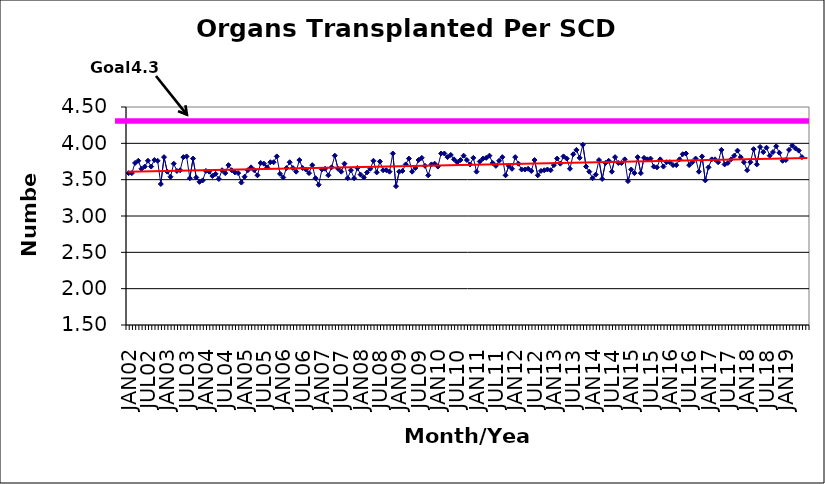
| Category | Series 0 |
|---|---|
| JAN02 | 3.59 |
| FEB02 | 3.59 |
| MAR02 | 3.73 |
| APR02 | 3.76 |
| MAY02 | 3.65 |
| JUN02 | 3.68 |
| JUL02 | 3.76 |
| AUG02 | 3.68 |
| SEP02 | 3.77 |
| OCT02 | 3.76 |
| NOV02 | 3.44 |
| DEC02 | 3.81 |
| JAN03 | 3.61 |
| FEB03 | 3.54 |
| MAR03 | 3.72 |
| APR03 | 3.62 |
| MAY03 | 3.63 |
| JUN03 | 3.81 |
| JUL03 | 3.82 |
| AUG03 | 3.52 |
| SEP03 | 3.79 |
| OCT03 | 3.53 |
| NOV03 | 3.47 |
| DEC03 | 3.49 |
| JAN04 | 3.62 |
| FEB04 | 3.61 |
| MAR04 | 3.55 |
| APR04 | 3.58 |
| MAY04 | 3.51 |
| JUN04 | 3.63 |
| JUL04 | 3.59 |
| AUG04 | 3.7 |
| SEP04 | 3.63 |
| OCT04 | 3.6 |
| NOV04 | 3.59 |
| DEC04 | 3.46 |
| JAN05 | 3.54 |
| FEB05 | 3.63 |
| MAR05 | 3.67 |
| APR05 | 3.63 |
| MAY05 | 3.56 |
| JUN05 | 3.73 |
| JUL05 | 3.72 |
| AUG05 | 3.67 |
| SEP05 | 3.74 |
| OCT05 | 3.74 |
| NOV05 | 3.82 |
| DEC05 | 3.58 |
| JAN06 | 3.53 |
| FEB06 | 3.66 |
| MAR06 | 3.74 |
| APR06 | 3.66 |
| MAY06 | 3.61 |
| JUN06 | 3.77 |
| JUL06 | 3.66 |
| AUG06 | 3.64 |
| SEP06 | 3.59 |
| OCT06 | 3.7 |
| NOV06 | 3.52 |
| DEC06 | 3.43 |
| JAN07 | 3.64 |
| FEB07 | 3.65 |
| MAR07 | 3.56 |
| APR07 | 3.67 |
| MAY07 | 3.83 |
| JUN07 | 3.65 |
| JUL07 | 3.61 |
| AUG07 | 3.72 |
| SEP07 | 3.52 |
| OCT07 | 3.63 |
| NOV07 | 3.52 |
| DEC07 | 3.66 |
| JAN08 | 3.57 |
| FEB08 | 3.53 |
| MAR08 | 3.6 |
| APR08 | 3.65 |
| MAY08 | 3.76 |
| JUN08 | 3.6 |
| JUL08 | 3.75 |
| AUG08 | 3.63 |
| SEP08 | 3.63 |
| OCT08 | 3.61 |
| NOV08 | 3.86 |
| DEC08 | 3.41 |
| JAN09 | 3.61 |
| FEB09 | 3.62 |
| MAR09 | 3.71 |
| APR09 | 3.79 |
| MAY09 | 3.61 |
| JUN09 | 3.66 |
| JUL09 | 3.77 |
| AUG09 | 3.8 |
| SEP09 | 3.69 |
| OCT09 | 3.56 |
| NOV09 | 3.71 |
| DEC09 | 3.72 |
| JAN10 | 3.68 |
| FEB10 | 3.86 |
| MAR10 | 3.86 |
| APR10 | 3.81 |
| MAY10 | 3.84 |
| JUN10 | 3.78 |
| JUL10 | 3.74 |
| AUG10 | 3.77 |
| SEP10 | 3.83 |
| OCT10 | 3.77 |
| NOV10 | 3.71 |
| DEC10 | 3.8 |
| JAN11 | 3.61 |
| FEB11 | 3.75 |
| MAR11 | 3.79 |
| APR11 | 3.8 |
| MAY11 | 3.83 |
| JUN11 | 3.73 |
| JUL11 | 3.69 |
| AUG11 | 3.76 |
| SEP11 | 3.81 |
| OCT11 | 3.56 |
| NOV11 | 3.69 |
| DEC11 | 3.65 |
| JAN12 | 3.81 |
| FEB12 | 3.72 |
| MAR12 | 3.64 |
| APR12 | 3.64 |
| MAY12 | 3.65 |
| JUN12 | 3.62 |
| JUL12 | 3.77 |
| AUG12 | 3.56 |
| SEP12 | 3.62 |
| OCT12 | 3.63 |
| NOV12 | 3.64 |
| DEC12 | 3.63 |
| JAN13 | 3.7 |
| FEB13 | 3.79 |
| MAR13 | 3.72 |
| APR13 | 3.82 |
| MAY13 | 3.79 |
| JUN13 | 3.65 |
| JUL13 | 3.85 |
| AUG13 | 3.91 |
| SEP13 | 3.8 |
| OCT13 | 3.98 |
| NOV13 | 3.68 |
| DEC13 | 3.61 |
| JAN14 | 3.52 |
| FEB14 | 3.57 |
| MAR14 | 3.77 |
| APR14 | 3.51 |
| MAY14 | 3.73 |
| JUN14 | 3.76 |
| JUL14 | 3.61 |
| AUG14 | 3.81 |
| SEP14 | 3.73 |
| OCT14 | 3.73 |
| NOV14 | 3.78 |
| DEC14 | 3.48 |
| JAN15 | 3.64 |
| FEB15 | 3.59 |
| MAR15 | 3.81 |
| APR15 | 3.59 |
| MAY15 | 3.8 |
| JUN15 | 3.78 |
| JUL15 | 3.79 |
| AUG15 | 3.68 |
| SEP15 | 3.67 |
| OCT15 | 3.78 |
| NOV15 | 3.68 |
| DEC15 | 3.74 |
| JAN16 | 3.74 |
| FEB16 | 3.7 |
| MAR16 | 3.7 |
| APR16 | 3.78 |
| MAY16 | 3.85 |
| JUN16 | 3.86 |
| JUL16 | 3.7 |
| AUG16 | 3.74 |
| SEP16 | 3.79 |
| OCT16 | 3.61 |
| NOV16 | 3.82 |
| DEC16 | 3.49 |
| JAN17 | 3.67 |
| FEB17 | 3.78 |
| MAR17 | 3.78 |
| APR17 | 3.74 |
| MAY17 | 3.91 |
| JUN17 | 3.71 |
| JUL17 | 3.73 |
| AUG17 | 3.78 |
| SEP17 | 3.83 |
| OCT17 | 3.9 |
| NOV17 | 3.81 |
| DEC17 | 3.74 |
| JAN18 | 3.63 |
| FEB18 | 3.74 |
| MAR18 | 3.92 |
| APR18 | 3.71 |
| MAY18 | 3.95 |
| JUN18 | 3.88 |
| JUL18 | 3.94 |
| AUG18 | 3.83 |
| SEP18 | 3.88 |
| OCT18 | 3.96 |
| NOV18 | 3.87 |
| DEC18 | 3.76 |
| JAN19 | 3.77 |
| FEB19 | 3.91 |
| MAR19 | 3.97 |
| APR19 | 3.93 |
| MAY19 | 3.9 |
| JUN19 | 3.81 |